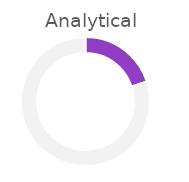
| Category | Analytical |
|---|---|
| 0 | 0.2 |
| 1 | 0.8 |